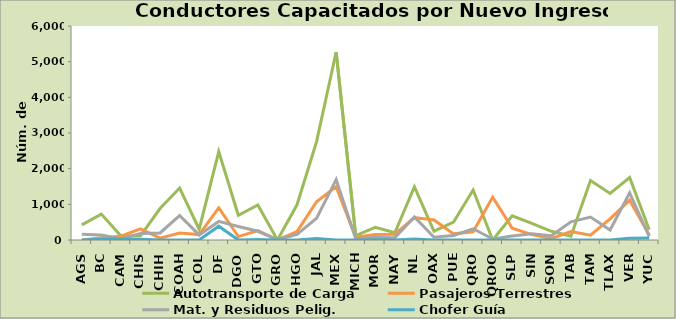
| Category | Autotransporte de Carga | Pasajeros Terrestres | Mat. y Residuos Pelig. | Chofer Guía |
|---|---|---|---|---|
| AGS | 424 | 0 | 161 | 0 |
| BC | 727 | 60 | 141 | 24 |
| CAM | 109 | 106 | 30 | 29 |
| CHIS | 119 | 312 | 180 | 20 |
| CHIH | 882 | 53 | 198 | 0 |
| COAH | 1457 | 193 | 686 | 0 |
| COL | 302 | 152 | 142 | 0 |
| DF | 2478 | 904 | 521 | 387 |
| DGO | 693 | 95 | 378 | 0 |
| GTO | 983 | 262 | 244 | 14 |
| GRO | 0 | 0 | 12 | 0 |
| HGO | 987 | 236 | 157 | 0 |
| JAL | 2759 | 1073 | 611 | 39 |
| MEX | 5270 | 1497 | 1693 | 0 |
| MICH | 125 | 77 | 38 | 0 |
| MOR | 356 | 157 | 73 | 4 |
| NAY | 202 | 162 | 66 | 0 |
| NL | 1489 | 628 | 646 | 26 |
| OAX | 246 | 562 | 78 | 0 |
| PUE | 502 | 172 | 128 | 0 |
| QRO | 1400 | 232 | 315 | 0 |
| QROO | 0 | 1203 | 29 | 0 |
| SLP | 676 | 329 | 113 | 0 |
| SIN | 468 | 150 | 174 | 1 |
| SON | 244 | 41 | 122 | 0 |
| TAB | 108 | 235 | 509 | 0 |
| TAM | 1667 | 136 | 642 | 0 |
| TLAX | 1307 | 593 | 279 | 0 |
| VER | 1753 | 1117 | 1320 | 52 |
| YUC | 289 | 140 | 98 | 55 |